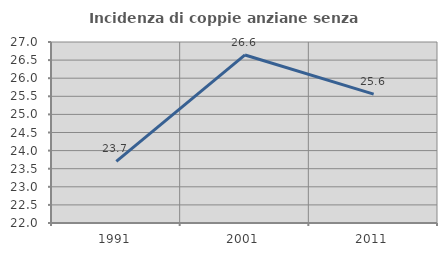
| Category | Incidenza di coppie anziane senza figli  |
|---|---|
| 1991.0 | 23.701 |
| 2001.0 | 26.642 |
| 2011.0 | 25.561 |